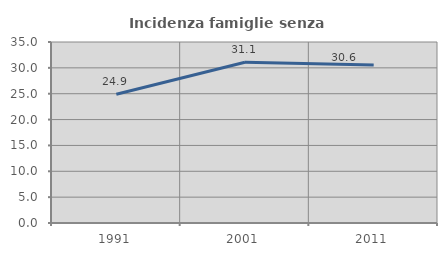
| Category | Incidenza famiglie senza nuclei |
|---|---|
| 1991.0 | 24.882 |
| 2001.0 | 31.072 |
| 2011.0 | 30.556 |